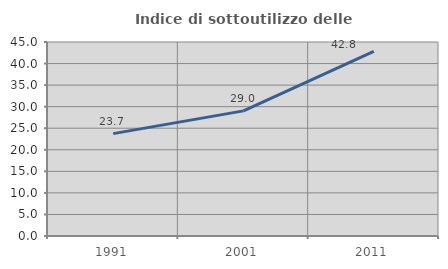
| Category | Indice di sottoutilizzo delle abitazioni  |
|---|---|
| 1991.0 | 23.748 |
| 2001.0 | 29.027 |
| 2011.0 | 42.832 |